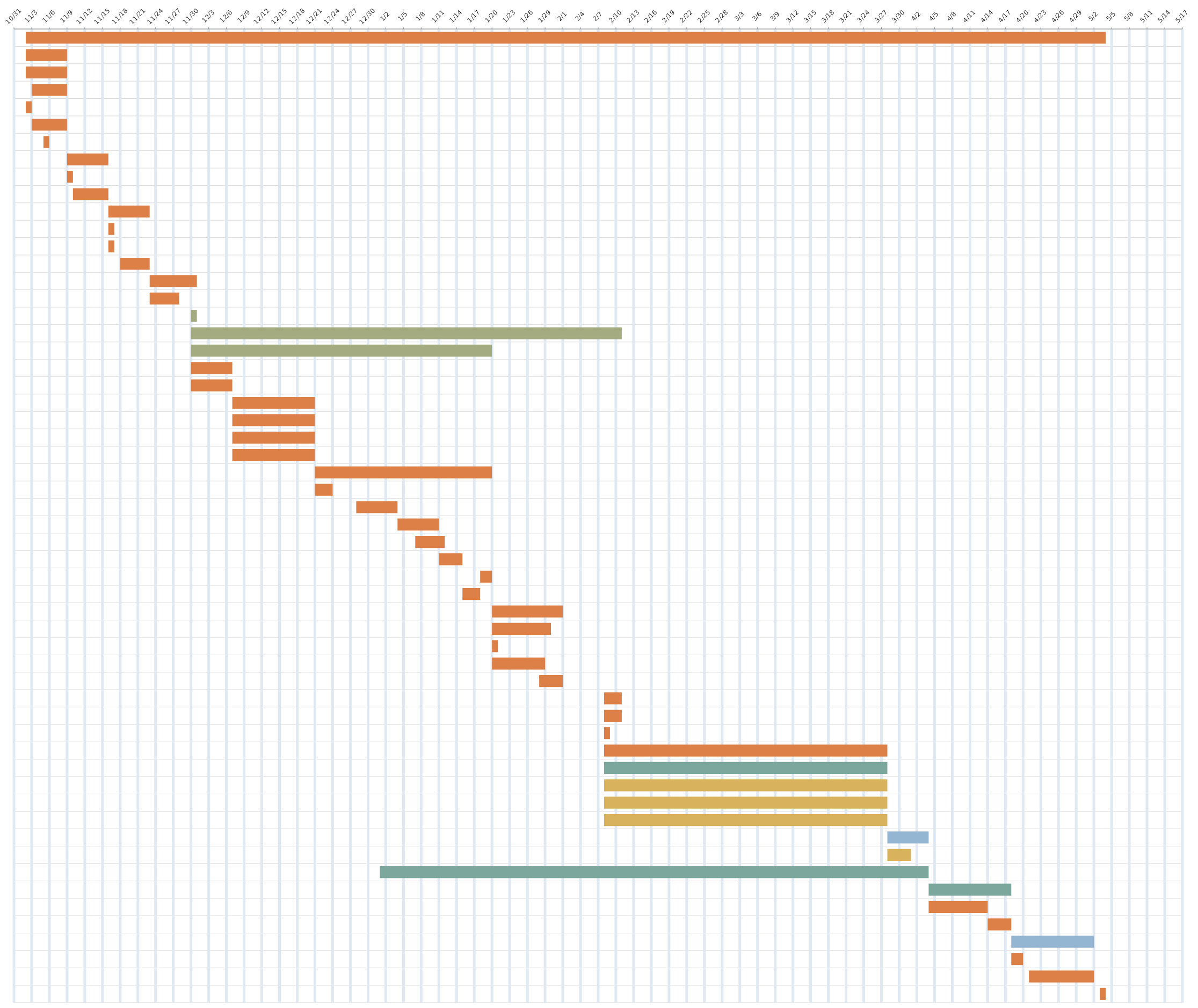
| Category | 05/03/22 | DURATION |
|---|---|---|
| 1.0 | 2021-11-02 | 183 |
| 2.0 | 2021-11-02 | 7 |
| 3.0 | 2021-11-02 | 7 |
| 4.0 | 2021-11-03 | 6 |
| 5.0 | 2021-11-02 | 1 |
| 6.0 | 2021-11-03 | 6 |
| 7.0 | 2021-11-05 | 1 |
| 8.0 | 2021-11-09 | 7 |
| 9.0 | 2021-11-09 | 1 |
| 10.0 | 2021-11-10 | 6 |
| 11.0 | 2021-11-16 | 7 |
| 12.0 | 2021-11-16 | 1 |
| 13.0 | 2021-11-16 | 1 |
| 14.0 | 2021-11-18 | 5 |
| 15.0 | 2021-11-23 | 8 |
| 16.0 | 2021-11-23 | 5 |
| 17.0 | 2021-11-30 | 1 |
| 18.0 | 2021-11-30 | 73 |
| 19.0 | 2021-11-30 | 51 |
| 20.0 | 2021-11-30 | 7 |
| 21.0 | 2021-11-30 | 7 |
| 22.0 | 2021-12-07 | 14 |
| 23.0 | 2021-12-07 | 14 |
| 24.0 | 2021-12-07 | 14 |
| 25.0 | 2021-12-07 | 14 |
| 26.0 | 2021-12-21 | 30 |
| 27.0 | 2021-12-21 | 3 |
| 28.0 | 2021-12-28 | 7 |
| 29.0 | 2022-01-04 | 7 |
| 30.0 | 2022-01-07 | 5 |
| 31.0 | 2022-01-11 | 4 |
| 32.0 | 2022-01-18 | 2 |
| 33.0 | 2022-01-15 | 3 |
| 34.0 | 2022-01-20 | 12 |
| 35.0 | 2022-01-20 | 10 |
| 36.0 | 2022-01-20 | 1 |
| 37.0 | 2022-01-20 | 9 |
| 38.0 | 2022-01-28 | 4 |
| 39.0 | 2022-02-08 | 3 |
| 40.0 | 2022-02-08 | 3 |
| 41.0 | 2022-02-08 | 1 |
| 42.0 | 2022-02-08 | 48 |
| 43.0 | 2022-02-08 | 48 |
| 44.0 | 2022-02-08 | 48 |
| 45.0 | 2022-02-08 | 48 |
| 46.0 | 2022-02-08 | 48 |
| 47.0 | 2022-03-28 | 7 |
| 48.0 | 2022-03-28 | 4 |
| 49.0 | 2022-01-01 | 93 |
| 50.0 | 2022-04-04 | 14 |
| 51.0 | 2022-04-04 | 10 |
| 52.0 | 2022-04-14 | 4 |
| 53.0 | 2022-04-18 | 14 |
| 54.0 | 2022-04-18 | 2 |
| 55.0 | 2022-04-21 | 11 |
| 56.0 | 2022-05-03 | 1 |